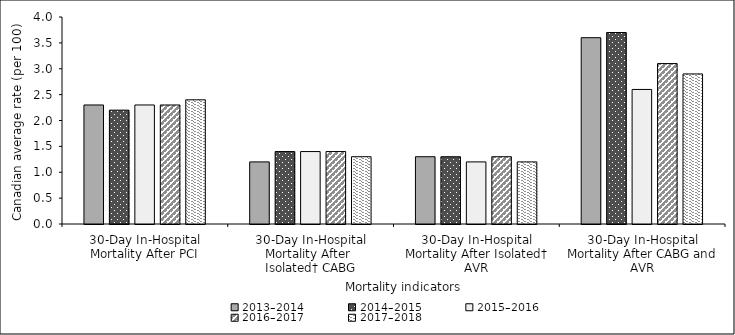
| Category | 2013–2014 | 2014–2015 | 2015–2016 | 2016–2017 | 2017–2018 |
|---|---|---|---|---|---|
| 30-Day In-Hospital Mortality After PCI | 2.3 | 2.2 | 2.3 | 2.3 | 2.4 |
| 30-Day In-Hospital Mortality After 
Isolated† CABG | 1.2 | 1.4 | 1.4 | 1.4 | 1.3 |
| 30-Day In-Hospital Mortality After Isolated† AVR | 1.3 | 1.3 | 1.2 | 1.3 | 1.2 |
| 30-Day In-Hospital Mortality After CABG and AVR | 3.6 | 3.7 | 2.6 | 3.1 | 2.9 |